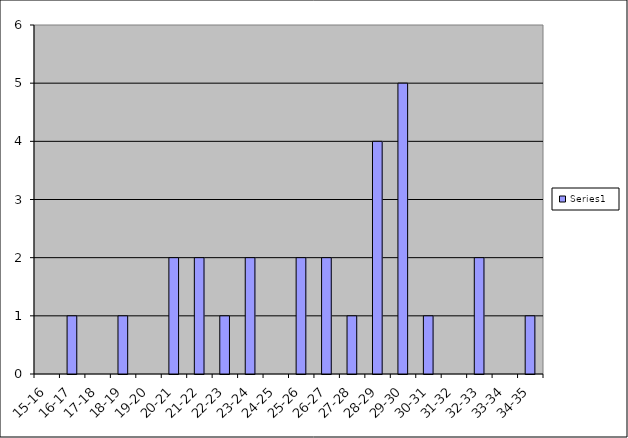
| Category | Series 0 |
|---|---|
| 15-16 | 0 |
| 16-17 | 1 |
| 17-18 | 0 |
| 18-19 | 1 |
| 19-20 | 0 |
| 20-21 | 2 |
| 21-22 | 2 |
| 22-23 | 1 |
| 23-24 | 2 |
| 24-25 | 0 |
| 25-26 | 2 |
| 26-27 | 2 |
| 27-28 | 1 |
| 28-29 | 4 |
| 29-30 | 5 |
| 30-31 | 1 |
| 31-32 | 0 |
| 32-33 | 2 |
| 33-34 | 0 |
| 34-35 | 1 |